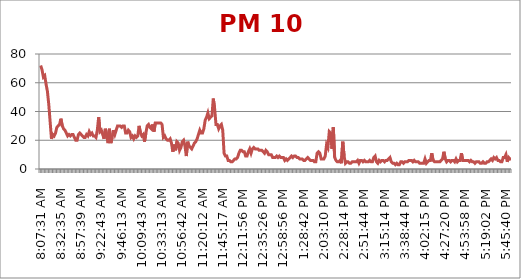
| Category | PM 10 (µg/m3) |
|---|---|
| 0.3385532407407407 | 72 |
| 0.3396412037037037 | 69 |
| 0.3407291666666667 | 64 |
| 0.3418171296296297 | 65 |
| 0.34290509259259255 | 59 |
| 0.34399305555555554 | 54 |
| 0.3450810185185185 | 45 |
| 0.34616898148148145 | 33 |
| 0.34725694444444444 | 21 |
| 0.34943287037037035 | 24 |
| 0.35052083333333334 | 23 |
| 0.3516087962962963 | 25 |
| 0.3526967592592593 | 29 |
| 0.3537847222222222 | 30 |
| 0.35487268518518517 | 31 |
| 0.35596064814814815 | 35 |
| 0.3570486111111111 | 30 |
| 0.35813657407407407 | 28 |
| 0.35922453703703705 | 27 |
| 0.36031250000000004 | 25 |
| 0.36140046296296297 | 23 |
| 0.36248842592592595 | 24 |
| 0.3646643518518518 | 23 |
| 0.3657523148148148 | 24 |
| 0.3668402777777778 | 24 |
| 0.3679282407407407 | 22 |
| 0.3690162037037037 | 20 |
| 0.3701041666666667 | 20 |
| 0.37119212962962966 | 24 |
| 0.3722800925925926 | 25 |
| 0.3733680555555556 | 24 |
| 0.37445601851851856 | 23 |
| 0.37554398148148144 | 22 |
| 0.3766319444444444 | 22 |
| 0.3777199074074074 | 24 |
| 0.37880787037037034 | 23 |
| 0.3798958333333333 | 26 |
| 0.3809837962962963 | 24 |
| 0.3820717592592593 | 25 |
| 0.3831597222222222 | 23 |
| 0.3842476851851852 | 23 |
| 0.3853356481481482 | 22 |
| 0.38642361111111106 | 27 |
| 0.38751157407407405 | 36 |
| 0.38968749999999996 | 26 |
| 0.39077546296296295 | 27 |
| 0.39186342592592593 | 24 |
| 0.3929513888888889 | 21 |
| 0.39403935185185185 | 28 |
| 0.39512731481481483 | 23 |
| 0.3962152777777778 | 18 |
| 0.3973032407407407 | 28 |
| 0.3983912037037037 | 18 |
| 0.39947916666666666 | 22 |
| 0.40056712962962965 | 27 |
| 0.4016550925925926 | 24 |
| 0.40274305555555556 | 27 |
| 0.40383101851851855 | 30 |
| 0.4049189814814815 | 30 |
| 0.40600694444444446 | 30 |
| 0.40709490740740745 | 29 |
| 0.4081828703703703 | 30 |
| 0.4092708333333333 | 30 |
| 0.4103587962962963 | 25 |
| 0.4114467592592593 | 25 |
| 0.4125347222222222 | 27 |
| 0.4136226851851852 | 26 |
| 0.4147106481481482 | 22 |
| 0.4157986111111111 | 23 |
| 0.4168865740740741 | 21 |
| 0.4179745370370371 | 23 |
| 0.41906249999999995 | 22 |
| 0.42015046296296293 | 23 |
| 0.4212384259259259 | 30 |
| 0.4223263888888889 | 25 |
| 0.42341435185185183 | 23 |
| 0.4245023148148148 | 24 |
| 0.4255902777777778 | 19 |
| 0.42667824074074073 | 25 |
| 0.4277662037037037 | 30 |
| 0.4288541666666667 | 31 |
| 0.4299421296296296 | 29 |
| 0.43103009259259256 | 28 |
| 0.43211805555555555 | 31 |
| 0.43320601851851853 | 26 |
| 0.43429398148148146 | 32 |
| 0.43538194444444445 | 32 |
| 0.43646990740740743 | 32 |
| 0.43755787037037036 | 32 |
| 0.43864583333333335 | 32 |
| 0.43973379629629633 | 31 |
| 0.4408217592592592 | 22 |
| 0.4419097222222222 | 23 |
| 0.4429976851851852 | 21 |
| 0.44408564814814816 | 20 |
| 0.4451736111111111 | 20 |
| 0.4462615740740741 | 21 |
| 0.44734953703703706 | 18 |
| 0.4484375 | 12 |
| 0.449525462962963 | 17 |
| 0.4506018518518518 | 13 |
| 0.4516898148148148 | 19 |
| 0.4527777777777778 | 18 |
| 0.4538657407407407 | 13 |
| 0.4549537037037037 | 15 |
| 0.4560416666666667 | 19 |
| 0.45712962962962966 | 20 |
| 0.4582175925925926 | 16 |
| 0.4593055555555556 | 9 |
| 0.46039351851851856 | 19 |
| 0.46148148148148144 | 16 |
| 0.4625694444444444 | 15 |
| 0.4636574074074074 | 14 |
| 0.46474537037037034 | 16 |
| 0.4658333333333333 | 18 |
| 0.4669212962962963 | 19 |
| 0.4680092592592593 | 21 |
| 0.4690972222222222 | 24 |
| 0.4701851851851852 | 27 |
| 0.4712731481481482 | 25 |
| 0.47236111111111106 | 25 |
| 0.47344907407407405 | 28 |
| 0.47453703703703703 | 34 |
| 0.47562499999999996 | 36 |
| 0.47671296296296295 | 39 |
| 0.47780092592592593 | 35 |
| 0.4788888888888889 | 36 |
| 0.47997685185185185 | 37 |
| 0.4821527777777778 | 49 |
| 0.4832407407407407 | 42 |
| 0.4843287037037037 | 31 |
| 0.48541666666666666 | 31 |
| 0.4865162037037037 | 28 |
| 0.48760416666666667 | 30 |
| 0.4886921296296296 | 31 |
| 0.4897800925925926 | 27 |
| 0.49086805555555557 | 11 |
| 0.4919560185185185 | 9 |
| 0.4930439814814815 | 9 |
| 0.49413194444444447 | 6 |
| 0.4952314814814815 | 6 |
| 0.4963194444444445 | 5 |
| 0.49740740740740735 | 5 |
| 0.49849537037037034 | 6 |
| 0.4995833333333333 | 7 |
| 0.5006712962962964 | 7 |
| 0.5039351851851852 | 8 |
| 0.5050231481481481 | 11 |
| 0.5061111111111111 | 13 |
| 0.507199074074074 | 13 |
| 0.508287037037037 | 12 |
| 0.509375 | 12 |
| 0.510462962962963 | 9 |
| 0.511550925925926 | 9 |
| 0.5126388888888889 | 12 |
| 0.5137268518518519 | 14 |
| 0.5148148148148148 | 11 |
| 0.5159027777777777 | 14 |
| 0.5169907407407407 | 15 |
| 0.5180787037037037 | 14 |
| 0.5191666666666667 | 14 |
| 0.5202546296296297 | 14 |
| 0.5213425925925926 | 13 |
| 0.5224305555555556 | 13 |
| 0.5235185185185185 | 13 |
| 0.5246064814814815 | 12 |
| 0.5256944444444445 | 11 |
| 0.5267824074074073 | 13 |
| 0.5278703703703703 | 12 |
| 0.5289583333333333 | 10 |
| 0.5300462962962963 | 10 |
| 0.5311342592592593 | 10 |
| 0.5322222222222223 | 8 |
| 0.5333101851851852 | 8 |
| 0.5343981481481481 | 8 |
| 0.5354861111111111 | 9 |
| 0.5365740740740741 | 8 |
| 0.537662037037037 | 9 |
| 0.53875 | 8 |
| 0.5398379629629629 | 8 |
| 0.5409259259259259 | 8 |
| 0.5420138888888889 | 6 |
| 0.5431018518518519 | 7 |
| 0.5441898148148149 | 6 |
| 0.5452777777777778 | 7 |
| 0.5463657407407407 | 8 |
| 0.5474537037037037 | 9 |
| 0.5485416666666666 | 8 |
| 0.5496296296296296 | 9 |
| 0.5507175925925926 | 9 |
| 0.5518055555555555 | 8 |
| 0.5528935185185185 | 8 |
| 0.5539814814814815 | 7 |
| 0.5572453703703704 | 7 |
| 0.5605092592592592 | 7 |
| 0.5615972222222222 | 6 |
| 0.5626851851851852 | 6 |
| 0.5659490740740741 | 7 |
| 0.567037037037037 | 8 |
| 0.568125 | 7 |
| 0.569212962962963 | 6 |
| 0.570300925925926 | 6 |
| 0.5724768518518518 | 6 |
| 0.5735648148148148 | 5 |
| 0.5790046296296296 | 5 |
| 0.5800925925925926 | 11 |
| 0.5811805555555556 | 12 |
| 0.5822685185185185 | 11 |
| 0.5833564814814814 | 7 |
| 0.5844444444444444 | 7 |
| 0.5855324074074074 | 7 |
| 0.5866203703703704 | 9 |
| 0.5877083333333334 | 17 |
| 0.5887962962962963 | 15 |
| 0.5898842592592592 | 26 |
| 0.5909722222222222 | 25 |
| 0.5931481481481481 | 14 |
| 0.5942361111111111 | 29 |
| 0.5953240740740741 | 8 |
| 0.596412037037037 | 6 |
| 0.5975 | 5 |
| 0.598587962962963 | 5 |
| 0.599675925925926 | 6 |
| 0.6007638888888889 | 4 |
| 0.6018518518518519 | 19 |
| 0.6029398148148148 | 9 |
| 0.6040277777777777 | 4 |
| 0.6051157407407407 | 5 |
| 0.6062037037037037 | 5 |
| 0.6072916666666667 | 4 |
| 0.6083796296296297 | 4 |
| 0.6094675925925926 | 5 |
| 0.6105555555555556 | 5 |
| 0.6116435185185185 | 5 |
| 0.6127314814814815 | 5 |
| 0.6138194444444445 | 6 |
| 0.6149074074074073 | 4 |
| 0.6159953703703703 | 6 |
| 0.6170833333333333 | 6 |
| 0.6181712962962963 | 5 |
| 0.6192592592592593 | 6 |
| 0.6203472222222223 | 5 |
| 0.6214351851851853 | 5 |
| 0.6225231481481481 | 5 |
| 0.6236111111111111 | 6 |
| 0.6246990740740741 | 5 |
| 0.625787037037037 | 5 |
| 0.626875 | 8 |
| 0.627962962962963 | 9 |
| 0.6290509259259259 | 5 |
| 0.6301388888888889 | 4 |
| 0.6312268518518519 | 6 |
| 0.6323148148148149 | 5 |
| 0.6334027777777778 | 6 |
| 0.6344907407407407 | 6 |
| 0.6355787037037037 | 5 |
| 0.6366666666666666 | 6 |
| 0.6377546296296296 | 6 |
| 0.6388425925925926 | 7 |
| 0.6399305555555556 | 8 |
| 0.6410185185185185 | 5 |
| 0.6421064814814815 | 4 |
| 0.6431944444444445 | 4 |
| 0.6442824074074074 | 3 |
| 0.6453703703703704 | 4 |
| 0.6464583333333334 | 3 |
| 0.6475462962962962 | 3 |
| 0.6486342592592592 | 5 |
| 0.6497222222222222 | 5 |
| 0.6508101851851852 | 4 |
| 0.6518981481481482 | 5 |
| 0.6529861111111112 | 5 |
| 0.6540740740740741 | 5 |
| 0.655162037037037 | 6 |
| 0.65625 | 6 |
| 0.657337962962963 | 6 |
| 0.6584259259259259 | 5 |
| 0.6595138888888888 | 6 |
| 0.6606018518518518 | 5 |
| 0.6616898148148148 | 5 |
| 0.6627777777777778 | 5 |
| 0.6638657407407408 | 4 |
| 0.6649537037037038 | 4 |
| 0.6660416666666666 | 4 |
| 0.6671296296296297 | 4 |
| 0.6682291666666668 | 7 |
| 0.6693171296296296 | 4 |
| 0.6704050925925925 | 5 |
| 0.6714930555555556 | 6 |
| 0.6725810185185185 | 6 |
| 0.6736805555555555 | 11 |
| 0.6747685185185185 | 6 |
| 0.6769444444444445 | 5 |
| 0.6780324074074073 | 5 |
| 0.6791203703703704 | 5 |
| 0.6802083333333333 | 5 |
| 0.6812962962962964 | 5 |
| 0.6823842592592593 | 6 |
| 0.6834722222222221 | 7 |
| 0.6845601851851852 | 12 |
| 0.6856481481481481 | 7 |
| 0.6878240740740741 | 5 |
| 0.6889120370370371 | 6 |
| 0.69 | 6 |
| 0.691087962962963 | 5 |
| 0.6921759259259259 | 6 |
| 0.6943518518518519 | 6 |
| 0.6954398148148148 | 5 |
| 0.6965277777777777 | 7 |
| 0.6976157407407407 | 5 |
| 0.6987037037037037 | 6 |
| 0.6997916666666667 | 6 |
| 0.7008796296296297 | 11 |
| 0.7019675925925926 | 6 |
| 0.7030555555555557 | 6 |
| 0.7041435185185185 | 6 |
| 0.7052314814814814 | 6 |
| 0.7074074074074074 | 6 |
| 0.7084953703703704 | 5 |
| 0.7095833333333333 | 6 |
| 0.7106712962962963 | 5 |
| 0.7117592592592592 | 5 |
| 0.7128472222222223 | 4 |
| 0.7139351851851852 | 5 |
| 0.715023148148148 | 5 |
| 0.7161111111111111 | 5 |
| 0.717199074074074 | 4 |
| 0.718287037037037 | 4 |
| 0.719375 | 5 |
| 0.720462962962963 | 4 |
| 0.721550925925926 | 4 |
| 0.7226388888888889 | 5 |
| 0.7237268518518518 | 5 |
| 0.7269907407407407 | 6 |
| 0.7280787037037038 | 7 |
| 0.7291666666666666 | 6 |
| 0.7302546296296296 | 8 |
| 0.7313425925925926 | 7 |
| 0.7324305555555556 | 8 |
| 0.7335185185185185 | 6 |
| 0.7346064814814816 | 6 |
| 0.7356944444444444 | 5 |
| 0.7367824074074073 | 5 |
| 0.7378703703703704 | 8 |
| 0.7389583333333333 | 8 |
| 0.7400462962962964 | 10 |
| 0.7411342592592592 | 5 |
| 0.7422222222222222 | 8 |
| 0.7433101851851852 | 7 |
| 0.7443981481481482 | 7 |